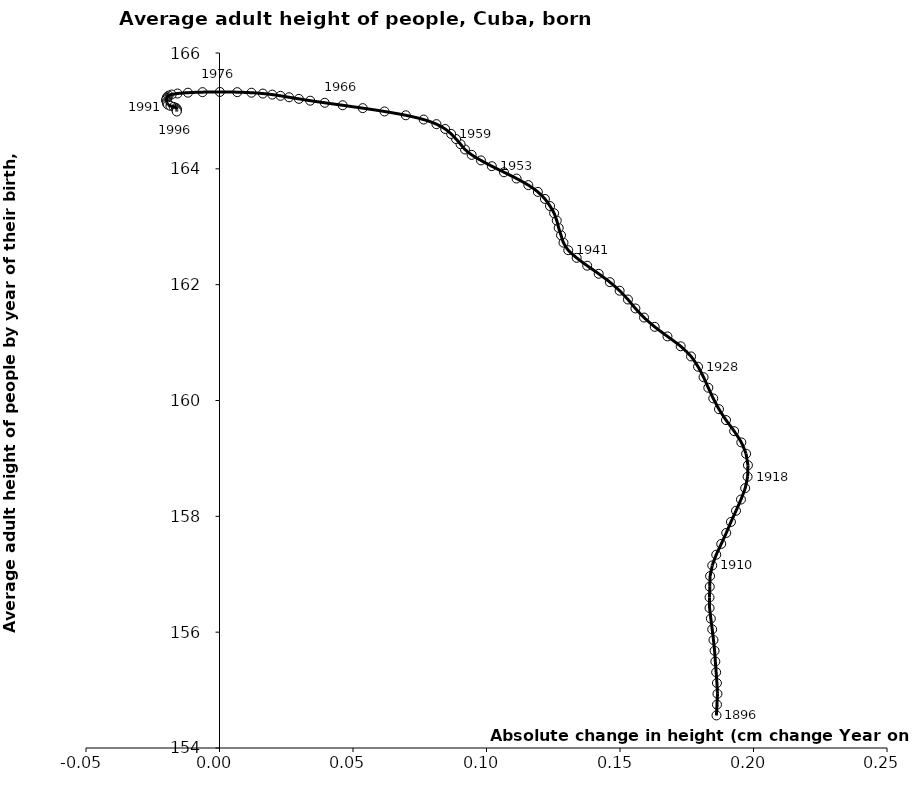
| Category | Series 0 |
|---|---|
| 0.1861322500000142 | 154.562 |
| 0.18632420000000138 | 154.749 |
| 0.18650472499999182 | 154.935 |
| 0.18630717499999605 | 155.122 |
| 0.1860133500000103 | 155.308 |
| 0.1857038500000101 | 155.494 |
| 0.18542512499999475 | 155.679 |
| 0.18500952499999812 | 155.864 |
| 0.18452562500000624 | 156.049 |
| 0.18402427499999874 | 156.234 |
| 0.1835386999999855 | 156.417 |
| 0.1835374749999943 | 156.601 |
| 0.1836219500000027 | 156.784 |
| 0.18373747500001514 | 156.968 |
| 0.18455482500000642 | 157.152 |
| 0.18604847499997845 | 157.337 |
| 0.187923524999988 | 157.524 |
| 0.1897892250000126 | 157.713 |
| 0.19155132500000605 | 157.903 |
| 0.1934491749999978 | 158.096 |
| 0.19530109999999468 | 158.29 |
| 0.1968763499999966 | 158.487 |
| 0.19778900000001443 | 158.684 |
| 0.19791750000001684 | 158.882 |
| 0.19722372500000063 | 159.08 |
| 0.1954378999999875 | 159.277 |
| 0.19274882499999535 | 159.471 |
| 0.1897044500000078 | 159.662 |
| 0.18707444999999723 | 159.85 |
| 0.18493719999999314 | 160.036 |
| 0.1830709999999982 | 160.22 |
| 0.18129119999998977 | 160.402 |
| 0.17922825000000842 | 160.583 |
| 0.17661019999999894 | 160.761 |
| 0.1727259000000032 | 160.936 |
| 0.16777907500001277 | 161.106 |
| 0.16300137499999323 | 161.271 |
| 0.15900225000000034 | 161.432 |
| 0.1557736249999948 | 161.589 |
| 0.1529757750000016 | 161.744 |
| 0.1498609000000073 | 161.895 |
| 0.1462008499999996 | 162.044 |
| 0.14203132500000493 | 162.188 |
| 0.13770424999998454 | 162.328 |
| 0.13376449999999807 | 162.463 |
| 0.13061640000000807 | 162.595 |
| 0.12883484999998984 | 162.724 |
| 0.1279160999999931 | 162.853 |
| 0.12703400000000897 | 162.98 |
| 0.1263147250000145 | 163.107 |
| 0.12532492500000103 | 163.233 |
| 0.12378290000000902 | 163.358 |
| 0.12187772499999028 | 163.48 |
| 0.11924654999998552 | 163.601 |
| 0.11566462500000796 | 163.719 |
| 0.11126235000000406 | 163.833 |
| 0.10653752499999314 | 163.941 |
| 0.10198744999999576 | 164.046 |
| 0.09792857499999741 | 164.145 |
| 0.09444060000001286 | 164.242 |
| 0.09195387500000152 | 164.334 |
| 0.09028282499998852 | 164.425 |
| 0.08859440000000518 | 164.515 |
| 0.08676467499999774 | 164.603 |
| 0.08451610000000187 | 164.688 |
| 0.08125367499999925 | 164.772 |
| 0.07645709999999895 | 164.851 |
| 0.06978240000000824 | 164.925 |
| 0.061791575000000876 | 164.991 |
| 0.0536371000000031 | 165.048 |
| 0.04611024999999813 | 165.098 |
| 0.03941032499999153 | 165.14 |
| 0.0339670250000097 | 165.177 |
| 0.029728675000001203 | 165.208 |
| 0.02605799999999192 | 165.236 |
| 0.022847450000000435 | 165.26 |
| 0.019762524999990205 | 165.282 |
| 0.016239849999990952 | 165.3 |
| 0.01197415000001456 | 165.314 |
| 0.006654500000010444 | 165.324 |
| 0.00013149999999484407 | 165.328 |
| -0.006362774999999488 | 165.324 |
| -0.011821725000004335 | 165.315 |
| -0.015737325000003466 | 165.301 |
| -0.017921899999990387 | 165.283 |
| -0.01903149999999698 | 165.265 |
| -0.019528825000008965 | 165.245 |
| -0.019705450000003566 | 165.226 |
| -0.019865549999991572 | 165.206 |
| -0.020026599999994232 | 165.186 |
| -0.0198214250000035 | 165.166 |
| -0.019657699999996225 | 165.146 |
| -0.01964505000000827 | 165.127 |
| -0.019286375000007183 | 165.107 |
| -0.018385224999988736 | 165.088 |
| -0.017162850000005392 | 165.07 |
| -0.016327800000013326 | 165.054 |
| -0.016033875000005082 | 165.038 |
| -0.015982599999986746 | 165.022 |
| -0.015997049999981527 | 165.006 |
| -0.01601149999997631 | 164.99 |